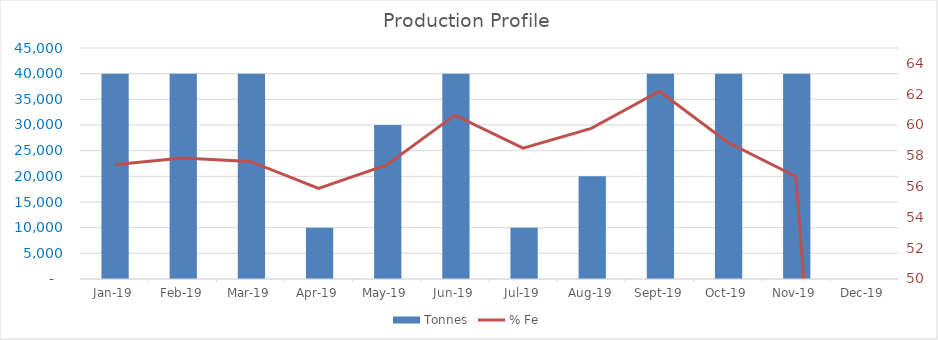
| Category | Tonnes |
|---|---|
| 43466.0 | 40000 |
| 43497.0 | 40000 |
| 43525.0 | 40000 |
| 43556.0 | 10000 |
| 43586.0 | 30000 |
| 43617.0 | 40000 |
| 43647.0 | 10000 |
| 43678.0 | 20000 |
| 43709.0 | 40000 |
| 43739.0 | 40000 |
| 43770.0 | 40000 |
| 43800.0 | 0 |